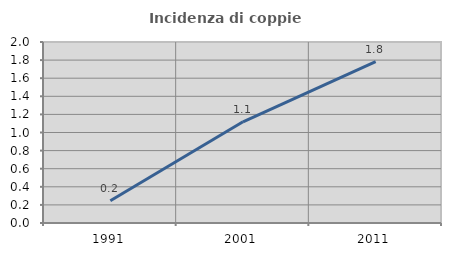
| Category | Incidenza di coppie miste |
|---|---|
| 1991.0 | 0.247 |
| 2001.0 | 1.118 |
| 2011.0 | 1.783 |